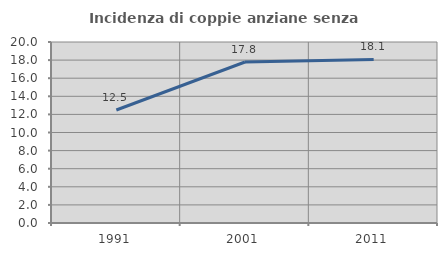
| Category | Incidenza di coppie anziane senza figli  |
|---|---|
| 1991.0 | 12.483 |
| 2001.0 | 17.791 |
| 2011.0 | 18.072 |